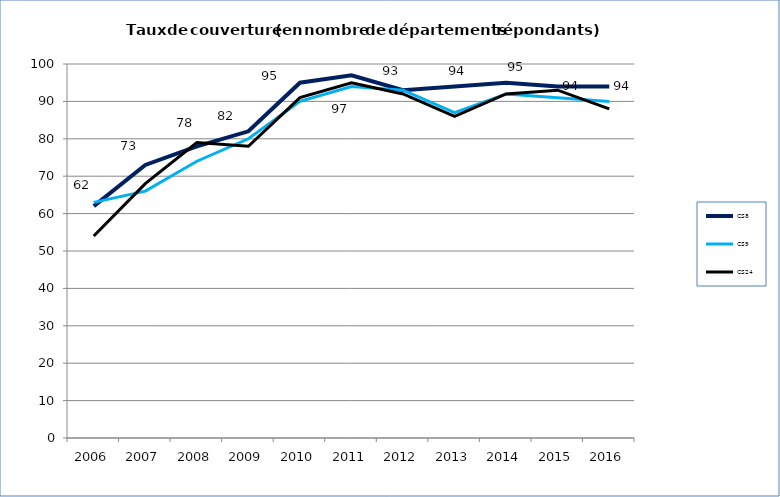
| Category | CS8 | CS9 | CS24 |
|---|---|---|---|
| 2006.0 | 62 | 63 | 54 |
| 2007.0 | 73 | 66 | 68 |
| 2008.0 | 78 | 74 | 79 |
| 2009.0 | 82 | 80 | 78 |
| 2010.0 | 95 | 90 | 91 |
| 2011.0 | 97 | 94 | 95 |
| 2012.0 | 93 | 93 | 92 |
| 2013.0 | 94 | 87 | 86 |
| 2014.0 | 95 | 92 | 92 |
| 2015.0 | 94 | 91 | 93 |
| 2016.0 | 94 | 90 | 88 |